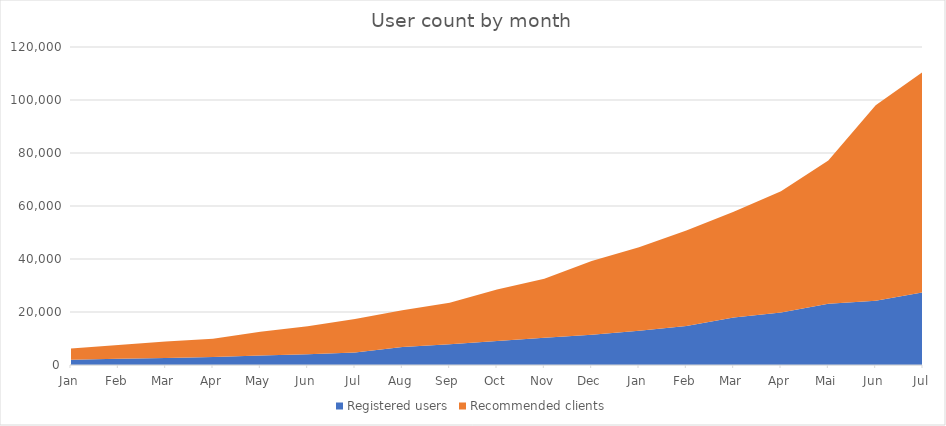
| Category | Registered users | Recommended clients |
|---|---|---|
| Jan | 1959 | 4295 |
| Feb | 2320 | 5194 |
| Mar | 2664 | 6226 |
| Apr | 3006 | 6944 |
| May | 3586 | 8993 |
| Jun | 4026 | 10554 |
| Jul | 4756 | 12593 |
| Aug | 6820 | 13848 |
| Sep | 7790 | 15720 |
| Oct | 9079 | 19370 |
| Nov | 10242 | 22339 |
| Dec | 11387 | 27841 |
| Jan | 12887 | 31519 |
| Feb | 14703 | 36012 |
| Mar | 17886 | 39952 |
| Apr | 19840 | 45685 |
| Mai | 23126 | 54088 |
| Jun | 24253 | 73743 |
| Jul | 27460 | 83200 |